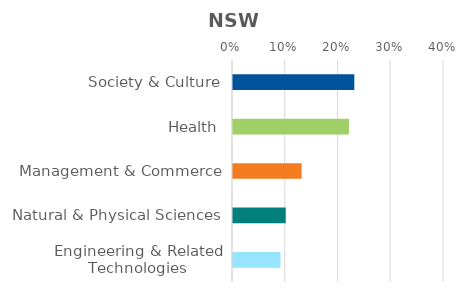
| Category | Series 0 |
|---|---|
| Society & Culture | 0.23 |
| Health | 0.22 |
| Management & Commerce | 0.13 |
| Natural & Physical Sciences | 0.1 |
| Engineering & Related Technologies | 0.09 |